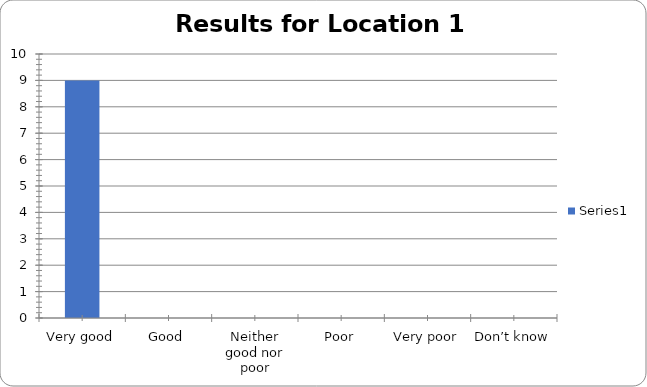
| Category | Series 0 |
|---|---|
| Very good | 9 |
| Good | 0 |
| Neither good nor poor | 0 |
| Poor | 0 |
| Very poor | 0 |
| Don’t know | 0 |